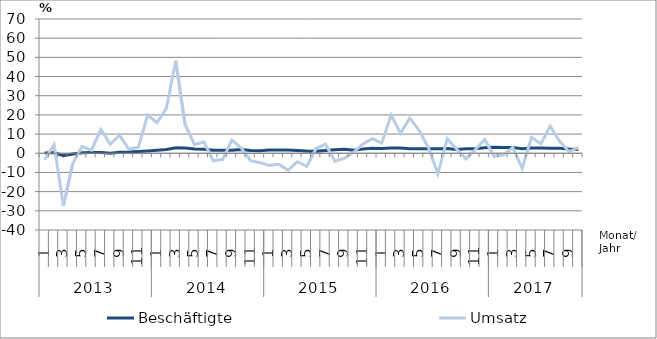
| Category | Beschäftigte | Umsatz |
|---|---|---|
| 0 | 0.1 | -3.4 |
| 1 | 0.4 | 4.5 |
| 2 | -1.3 | -27.5 |
| 3 | -0.4 | -5.3 |
| 4 | 0.3 | 3.6 |
| 5 | 0.4 | 1.6 |
| 6 | 0.4 | 12.4 |
| 7 | 0 | 4.7 |
| 8 | 0.5 | 9.4 |
| 9 | 0.6 | 2.1 |
| 10 | 0.9 | 3.2 |
| 11 | 1.2 | 19.9 |
| 12 | 1.6 | 15.9 |
| 13 | 2 | 23.5 |
| 14 | 2.9 | 48.2 |
| 15 | 2.8 | 14.9 |
| 16 | 2.2 | 4.5 |
| 17 | 2.1 | 6 |
| 18 | 1.6 | -3.9 |
| 19 | 1.6 | -3.2 |
| 20 | 1.6 | 6.8 |
| 21 | 2 | 2.7 |
| 22 | 1.4 | -3.9 |
| 23 | 1.3 | -4.9 |
| 24 | 1.7 | -6.3 |
| 25 | 1.7 | -5.7 |
| 26 | 1.7 | -8.8 |
| 27 | 1.5 | -4.4 |
| 28 | 1.2 | -6.8 |
| 29 | 1.1 | 2.5 |
| 30 | 1.5 | 4.7 |
| 31 | 1.8 | -4.1 |
| 32 | 2.1 | -2.6 |
| 33 | 1.6 | 0.5 |
| 34 | 2.2 | 4.9 |
| 35 | 2.6 | 7.6 |
| 36 | 2.5 | 5.3 |
| 37 | 2.7 | 19.9 |
| 38 | 2.8 | 10.5 |
| 39 | 2.4 | 18.3 |
| 40 | 2.4 | 11.9 |
| 41 | 2.4 | 2.8 |
| 42 | 2.3 | -10.7 |
| 43 | 2.5 | 7.5 |
| 44 | 2 | 2.2 |
| 45 | 2.4 | -2.9 |
| 46 | 2.3 | 1.9 |
| 47 | 2.9 | 7.2 |
| 48 | 3.1 | -1.6 |
| 49 | 3 | -0.8 |
| 50 | 3 | 3.1 |
| 51 | 2.4 | -7.9 |
| 52 | 2.8 | 8.3 |
| 53 | 2.7 | 4.9 |
| 54 | 2.6 | 14.1 |
| 55 | 2.6 | 6.3 |
| 56 | 2.2 | 0.9 |
| 57 | 2 | 3 |